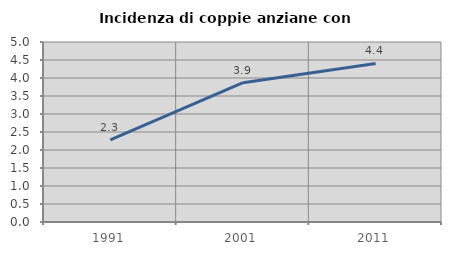
| Category | Incidenza di coppie anziane con figli |
|---|---|
| 1991.0 | 2.282 |
| 2001.0 | 3.869 |
| 2011.0 | 4.404 |